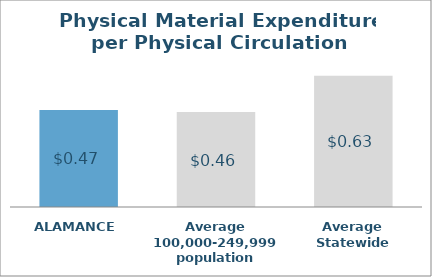
| Category | Series 0 |
|---|---|
| ALAMANCE | 0.468 |
| Average 100,000-249,999 population | 0.458 |
| Average Statewide | 0.633 |